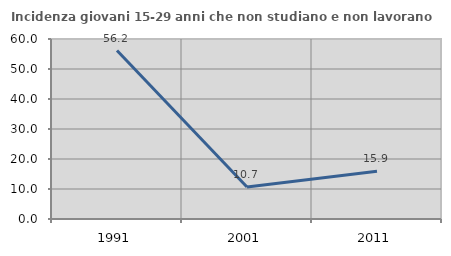
| Category | Incidenza giovani 15-29 anni che non studiano e non lavorano  |
|---|---|
| 1991.0 | 56.154 |
| 2001.0 | 10.68 |
| 2011.0 | 15.909 |